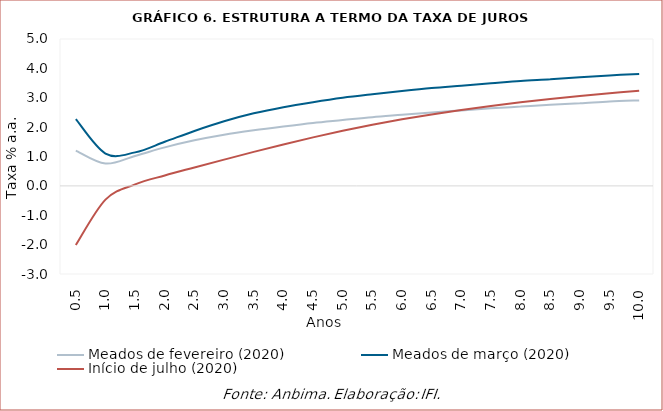
| Category | Meados de fevereiro (2020) | Meados de março (2020) | Início de julho (2020) |
|---|---|---|---|
| 0.5 | 1.2 | 2.27 | -2.015 |
| 1.0 | 0.76 | 1.1 | -0.47 |
| 1.5 | 1.02 | 1.14 | 0.051 |
| 2.0 | 1.31 | 1.5 | 0.356 |
| 2.5 | 1.55 | 1.87 | 0.626 |
| 3.0 | 1.74 | 2.2 | 0.893 |
| 3.5 | 1.89 | 2.47 | 1.157 |
| 4.0 | 2.02 | 2.68 | 1.412 |
| 4.5 | 2.14 | 2.85 | 1.652 |
| 5.0 | 2.24 | 3 | 1.874 |
| 5.5 | 2.34 | 3.12 | 2.079 |
| 6.0 | 2.42 | 3.23 | 2.265 |
| 6.5 | 2.5 | 3.33 | 2.433 |
| 7.0 | 2.57 | 3.41 | 2.586 |
| 7.5 | 2.64 | 3.49 | 2.723 |
| 8.0 | 2.7 | 3.57 | 2.847 |
| 8.5 | 2.76 | 3.63 | 2.959 |
| 9.0 | 2.81 | 3.7 | 3.06 |
| 9.5 | 2.87 | 3.76 | 3.152 |
| 10.0 | 2.91 | 3.81 | 3.236 |